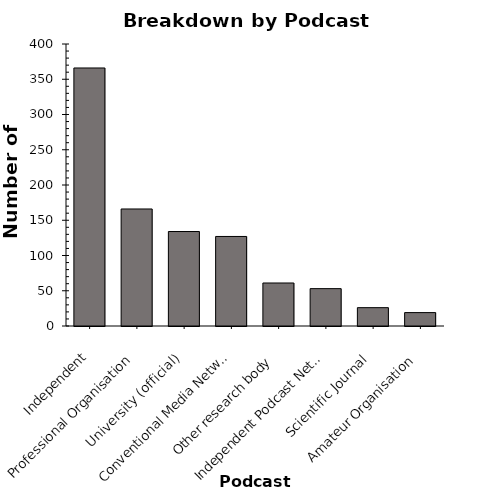
| Category | blah |
|---|---|
| Independent | 366 |
| Professional Organisation | 166 |
| University (official) | 134 |
| Conventional Media Network | 127 |
| Other research body | 61 |
| Independent Podcast Network | 53 |
| Scientific Journal | 26 |
| Amateur Organisation | 19 |